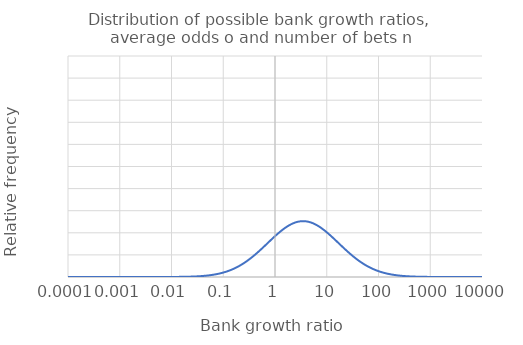
| Category | Probability mass function |
|---|---|
| 1.9287498479639178e-22 | 0 |
| 2.1315982402125517e-22 | 0 |
| 2.355780384104144e-22 | 0 |
| 2.6035399698849826e-22 | 0 |
| 2.877356658764434e-22 | 0 |
| 3.179970900197772e-22 | 0 |
| 3.5144113592254203e-22 | 0 |
| 3.884025228370648e-22 | 0 |
| 4.292511727467372e-22 | 0 |
| 4.743959126695607e-22 | 0 |
| 5.242885663363538e-22 | 0 |
| 5.7942847619451405e-22 | 0 |
| 6.403675009950656e-22 | 0 |
| 7.077155389805258e-22 | 0 |
| 7.821466319515107e-22 | 0 |
| 8.64405711303628e-22 | 0 |
| 9.55316053551265e-22 | 0 |
| 1.0557875199556575e-21 | 0 |
| 1.1668256627222069e-21 | 0 |
| 1.2895417889049291e-21 | 0 |
| 1.4251640827409756e-21 | 0 |
| 1.5750498977312845e-21 | 0 |
| 1.740699341490641e-21 | 0 |
| 1.92377028932889e-21 | 0 |
| 2.1260949768242666e-21 | 0 |
| 2.3496983374529006e-21 | 0 |
| 2.5968182688036488e-21 | 0 |
| 2.8699280302093464e-21 | 0 |
| 3.1717609959575027e-21 | 0 |
| 3.5053380118188886e-21 | 0 |
| 3.873997628687352e-21 | 0 |
| 4.281429515919289e-21 | 0 |
| 4.731711388784703e-21 | 0 |
| 5.2293498196121955e-21 | 0 |
| 5.7793253410795405e-21 | 0 |
| 6.38714229305874e-21 | 0 |
| 7.058883911899535e-21 | 0 |
| 7.801273213503439e-21 | 0 |
| 8.621740279526566e-21 | 0 |
| 9.52849662013418e-21 | 0 |
| 1.053061735755441e-20 | 0 |
| 1.1638132052951775e-20 | 0 |
| 1.2862125085646354e-20 | 0 |
| 1.4214846589307618e-20 | 0 |
| 1.5709835055409612e-20 | 0 |
| 1.7362052831004057e-20 | 0 |
| 1.918803586691868e-20 | 0 |
| 2.1206059215111002e-20 | 0 |
| 2.3436319931530804e-20 | 0 |
| 2.5901139215044538e-20 | 0 |
| 2.862518580549597e-20 | 0 |
| 3.163572287674602e-20 | 0 |
| 3.496288089568022e-20 | 0 |
| 3.8639959178048484e-20 | 0 |
| 4.270375915920945e-20 | 0 |
| 4.719495271526492e-20 | 0 |
| 5.215848922086619e-20 | 0 |
| 5.764404541766354e-20 | 0 |
| 6.370652259583364e-20 | 0 |
| 7.040659606464455e-20 | 0 |
| 7.78113224113446e-20 | 0 |
| 8.599481062602604e-20 | 0 |
| 9.50389638093068e-20 | 0 |
| 1.0503429888609e-19 | 0 |
| 1.1608085252937222e-19 | 0 |
| 1.2828918236089033e-19 | 0 |
| 1.4178147344895955e-19 | 0 |
| 1.5669276117770492e-19 | 0 |
| 1.731722827265726e-19 | 0 |
| 1.913849706861821e-19 | 0 |
| 2.1151310375912909e-19 | 0 |
| 2.3375813106650675e-19 | 0 |
| 2.583426883184192e-19 | 0 |
| 2.8551282602699863e-19 | 0 |
| 3.155404720626312e-19 | 0 |
| 3.487261531994818e-19 | 0 |
| 3.8540200288846083e-19 | 0 |
| 4.2593508536043427e-19 | 0 |
| 4.707310693284212e-19 | 0 |
| 5.202382880564233e-19 | 0 |
| 5.749522264294214e-19 | 0 |
| 6.354204799326421e-19 | 0 |
| 7.022482351712277e-19 | 0 |
| 7.761043267811902e-19 | 0 |
| 8.577279313512516e-19 | 0 |
| 9.4793596535059e-19 | 0 |
| 1.0476312611034384e-18 | 0 |
| 1.1578116026384373e-18 | 0 |
| 1.2795797118465605e-18 | 0 |
| 1.4141542848924377e-18 | 0 |
| 1.5628821893351887e-18 | 0 |
| 1.7272519440316511e-18 | 0 |
| 1.9089086167334096e-18 | 0 |
| 2.10967028847778e-18 | 0 |
| 2.3315462495539077e-18 | 0 |
| 2.576757109155329e-18 | 0 |
| 2.8477570199831504e-18 | 0 |
| 3.1472582402311535e-18 | 0 |
| 3.478258278777416e-18 | 0 |
| 3.844069895260664e-18 | 0 |
| 4.248354255292193e-18 | 0 |
| 4.6951575726318636e-18 | 0 |
| 5.188951605055393e-18 | 0 |
| 5.734678409209182e-18 | 0 |
| 6.337799802374316e-18 | 0 |
| 7.00435202616969e-18 | 0 |
| 7.74100615928699e-18 | 0 |
| 8.555134883888458e-18 | 0 |
| 9.454886273888019e-18 | 0 |
| 1.0449265343613678e-17 | 0 |
| 1.1548224173017592e-17 | 0 |
| 1.2762761511437256e-17 | 0 |
| 1.4105032856775672e-17 | 0 |
| 1.5588472111809966e-17 | 0 |
| 1.7227926035205676e-17 | 0 |
| 1.9039802832867636e-17 | 0 |
| 2.104223637677967e-17 | 0 |
| 2.325526769489041e-17 | 0 |
| 2.570104554845702e-17 | 0 |
| 2.840404810429232e-17 | 0 |
| 3.139132792048565e-17 | 0 |
| 3.469278269749689e-17 | 0 |
| 3.834145450439163e-17 | 0 |
| 4.237386047497423e-17 | 0 |
| 4.683035828353674e-17 | 0 |
| 5.1755550058027877e-17 | 0 |
| 5.71987287731409e-17 | 0 |
| 6.321437159097217e-17 | 0 |
| 6.986268508676995e-17 | 0 |
| 7.721020781657552e-17 | 0 |
| 8.533047625745642e-17 | 0 |
| 9.43047607852855e-17 | 0 |
| 1.0422287905597846e-16 | 0 |
| 1.1518409493078306e-16 | 0 |
| 1.2729811194236624e-16 | 0 |
| 1.4068617124464166e-16 | 0 |
| 1.5548226503498862e-16 | 0 |
| 1.718344775931998e-16 | 0 |
| 1.8990646735872619e-16 | 0 |
| 2.0987910487934672e-16 | 0 |
| 2.3195228302440306e-16 | 0 |
| 2.563469175798224e-16 | 0 |
| 2.833071582475551e-16 | 0 |
| 3.131028321778537e-16 | 0 |
| 3.4603214449008444e-16 | 0 |
| 3.8242466280979234e-16 | 0 |
| 4.226446156922688e-16 | 0 |
| 4.670945379443546e-16 | 0 |
| 5.162192993280835e-16 | 0 |
| 5.705105569667864e-16 | 0 |
| 6.305116760148333e-16 | 0 |
| 6.968231678387296e-16 | 0 |
| 7.70108700136711e-16 | 0 |
| 8.511017391481338e-16 | 0 |
| 9.406128904301246e-16 | 0 |
| 1.039538011670451e-15 | 0 |
| 1.1488671787323672e-15 | 0 |
| 1.2696945946666312e-15 | 0 |
| 1.40322954086341e-15 | 0 |
| 1.5508084799468865e-15 | 0 |
| 1.7139084315424027e-15 | 0 |
| 1.894161754785313e-15 | 0 |
| 2.093372485519867e-15 | 0 |
| 2.3135343916962954e-15 | 0 |
| 2.5568509276705832e-15 | 0 |
| 2.8257572871162737e-15 | 0 |
| 3.122944775261248e-15 | 0 |
| 3.4513877443750256e-15 | 0 |
| 3.814373362085991e-15 | 0 |
| 4.215534510459875e-15 | 0 |
| 4.658886145104523e-15 | 0 |
| 5.1488654781950874e-15 | 0 |
| 5.690376387584882e-15 | 0 |
| 6.28883849646318e-15 | 0 |
| 6.950241414765698e-15 | 0 |
| 7.681204685204004e-15 | 0 |
| 8.489044033873888e-15 | 0 |
| 9.381844588501017e-15 | 0 |
| 1.036854179711673e-14 | 0 |
| 1.145901085702524e-14 | 0 |
| 1.2664165549097415e-14 | 0 |
| 1.3996067466557998e-14 | 0 |
| 1.546804673146463e-14 | 0 |
| 1.7094835407049807e-14 | 0 |
| 1.889271494116135e-14 | 0 |
| 2.0879679116464823e-14 | 0 |
| 2.307561413826839e-14 | 0 |
| 2.550249766234951e-14 | 0 |
| 2.8184618754720903e-14 | 0 |
| 3.114882098476706e-14 | 0 |
| 3.442477108470906e-14 | 0 |
| 3.804525586423197e-14 | 0 |
| 4.2046510351896226e-14 | 0 |
| 4.646858044748244e-14 | 0 |
| 5.135572371481633e-14 | 0 |
| 5.6756852326342954e-14 | 0 |
| 6.272602259258849e-14 | 0 |
| 6.932297597588493e-14 | 0 |
| 7.661373700300492e-14 | 0 |
| 8.467127406081728e-14 | 0 |
| 9.357622968842834e-14 | 0 |
| 1.0341772767481818e-13 | 0 |
| 1.1429426503967626e-13 | 0 |
| 1.263146978246806e-13 | 0 |
| 1.3959933056135048e-13 | 0 |
| 1.5428112031923373e-13 | 0 |
| 1.7050700738494725e-13 | 0 |
| 1.8843938588995363e-13 | 0 |
| 2.082577291056116e-13 | 0 |
| 2.301603856719986e-13 | 0 |
| 2.543665647377682e-13 | 0 |
| 2.8111852987898835e-13 | 0 |
| 3.1068402375443836e-13 | 0 |
| 3.4335894776412945e-13 | 0 |
| 3.794703235299718e-13 | 0 |
| 4.193795658380826e-13 | 0 |
| 4.634860997994409e-13 | 0 |
| 5.1223135843065e-13 | 0 |
| 5.661032006639385e-13 | 0 |
| 6.256407940033283e-13 | 0 |
| 6.914400106942365e-13 | 0 |
| 7.64159391413186e-13 | 0 |
| 8.445267361642401e-13 | 0 |
| 9.333463883460648e-13 | 0 |
| 1.031507284891012e-12 | 0 |
| 1.1399918530447199e-12 | 0 |
| 1.2598858428281937e-12 | 0 |
| 1.3923891935889478e-12 | 0 |
| 1.5388280433973104e-12 | 0 |
| 1.7006680014819602e-12 | 0 |
| 1.8795288165396976e-12 | 0 |
| 2.0772005877248162e-12 | 0 |
| 2.295661680563113e-12 | 0 |
| 2.5370985270990234e-12 | 0 |
| 2.8039275084424048e-12 | 0 |
| 3.0988191387228603e-12 | 0 |
| 3.424724792492736e-12 | 0 |
| 3.7849062430756345e-12 | 0 |
| 4.182968307490155e-12 | 0 |
| 4.622894924670239e-12 | 0 |
| 5.1090890280650675e-12 | 0 |
| 5.6464166116768965e-12 | 0 |
| 6.240255430564552e-12 | 0 |
| 6.896548823223582e-12 | 0 |
| 7.621865194515543e-12 | 0 |
| 8.42346375447158e-12 | 0 |
| 9.309367170906311e-12 | 0 |
| 1.0288441862973836e-11 | 0 |
| 1.1370486739270737e-11 | 0 |
| 1.2566331268606837e-11 | 0 |
| 1.3887943864968955e-11 | 0 |
| 1.5348551671430818e-11 | 0 |
| 1.6962772941846738e-11 | 0 |
| 1.874676334524954e-11 | 0 |
| 2.0718377657216365e-11 | 0 |
| 2.2897348456463827e-11 | 0 |
| 2.5305483615128175e-11 | 0 |
| 2.7966884559279504e-11 | 0 |
| 3.0908187484094626e-11 | 0 |
| 3.415882993785115e-11 | 0 |
| 3.775134544280492e-11 | 0 |
| 4.17216891016157e-11 | 0 |
| 4.6109597448099425e-11 | 0 |
| 5.0958986143814656e-11 | 0 |
| 5.6318389500763924e-11 | 0 |
| 6.224144622910127e-11 | 0 |
| 6.8787436271372e-11 | 0 |
| 7.602187409610241e-11 | 0 |
| 8.401716438862092e-11 | 0 |
| 9.285332670148491e-11 | 0 |
| 1.0261879631705828e-10 | 0 |
| 1.1341130933754135e-10 | 0 |
| 1.2533888086073202e-10 | 0 |
| 1.3852088603142962e-10 | 0 |
| 1.5308925478800744e-10 | 0 |
| 1.6918979226157917e-10 | 0 |
| 1.869836380427578e-10 | 0 |
| 2.0664887892083952e-10 | 0 |
| 2.283823312362479e-10 | 0 |
| 2.524015106846211e-10 | 0 |
| 2.7894680928700346e-10 | 0 |
| 3.0828390131399067e-10 | 0 |
| 3.407064022431259e-10 | 0 |
| 3.7653880736128686e-10 | 0 |
| 4.161397394225834e-10 | 0 |
| 4.5990553786541793e-10 | 0 |
| 5.082742255107992e-10 | 0 |
| 5.617298924419595e-10 | 0 |
| 6.208075409406161e-10 | 0 |
| 6.860984399696268e-10 | 0 |
| 7.582560427915031e-10 | 0 |
| 8.380025269482943e-10 | 0 |
| 9.261360220571604e-10 | 0 |
| 1.0235385977598416e-09 | 0 |
| 1.1311850917721068e-09 | 0 |
| 1.2501528663872668e-09 | 0 |
| 1.38163259108012e-09 | 0 |
| 1.5269401591272541e-09 | 0 |
| 1.6875298575092453e-09 | 0 |
| 1.8650089219035623e-09 | 0 |
| 2.0611536224394367e-09 | 0 |
| 2.2779270412063423e-09 | 0 |
| 2.5174987194393603e-09 | 0 |
| 2.782266371017069e-09 | 0 |
| 3.074879879587939e-09 | 0 |
| 3.3982678194965443e-09 | 0 |
| 3.75566676593993e-09 | 0 |
| 4.150653687700037e-09 | 0 |
| 4.587181746649529e-09 | 0 |
| 5.06961986232452e-09 | 0 |
| 5.602796437539736e-09 | 0 |
| 6.1920476826667665e-09 | 0 |
| 6.843271022221027e-09 | 0 |
| 7.562984118268498e-09 | 0 |
| 8.35839010137835e-09 | 0 |
| 9.23744966197473e-09 | 0 |
| 1.0208960723602207e-08 | 0 |
| 1.1282646495501697e-08 | 0 |
| 1.2469252785756615e-08 | 0 |
| 1.3780655548951985e-08 | 0 |
| 1.5229979744719554e-08 | 0 |
| 1.6831730696745253e-08 | 0 |
| 1.8601939266924034e-08 | 0 |
| 2.0558322297613905e-08 | 0 |
| 2.2720459927749048e-08 | 0 |
| 2.5109991557451416e-08 | 0 |
| 2.775083242242038e-08 | 0 |
| 3.0669412945649824e-08 | 0 |
| 3.389494326198502e-08 | 0 |
| 3.745970556297002e-08 | 0 |
| 4.1399377187871084e-08 | 0 |
| 4.575338769447957e-08 | 0 |
| 5.05653134833791e-08 | 0 |
| 5.588331392520908e-08 | 0 |
| 6.176061335583303e-08 | 0 |
| 6.825603376338119e-08 | 0 |
| 7.54345834984785e-08 | 0 |
| 8.336810789966771e-08 | 0 |
| 9.213600834570554e-08 | 0 |
| 1.0182603693124907e-07 | 0 |
| 1.1253517471931329e-07 | 0 |
| 1.2437060236034683e-07 | 0 |
| 1.3745077279220577e-07 | 0 |
| 1.5190659675696923e-07 | 0 |
| 1.6788275299964684e-07 | 0 |
| 1.855391362616868e-07 | 0 |
| 2.0505245756129103e-07 | 0 |
| 2.266180127766797e-07 | 0 |
| 2.5045163723288184e-07 | 0 |
| 2.76791865854213e-07 | 0 |
| 3.0590232050197195e-07 | 0 |
| 3.3807434839063524e-07 | 0 |
| 3.736299379887046e-07 | 0 |
| 4.1292494158752376e-07 | 0 |
| 4.5635263679061665e-07 | 0 |
| 5.043476625681282e-07 | 0 |
| 5.57390369269725e-07 | 0 |
| 6.16011626132346e-07 | 0 |
| 6.807981343979572e-07 | 0 |
| 7.523982992167781e-07 | 0 |
| 8.315287191039623e-07 | 0 |
| 9.189813578983929e-07 | 0 |
| 1.0156314710029718e-06 | 0 |
| 1.1224463652348746e-06 | 0 |
| 1.2404950799572996e-06 | 0 |
| 1.3709590863847322e-06 | 0 |
| 1.515144112143965e-06 | 0 |
| 1.6744932094350571e-06 | 0 |
| 1.8506011975827791e-06 | 0 |
| 2.0452306245244524e-06 | 0 |
| 2.2603294069821185e-06 | 0 |
| 2.498050325867811e-06 | 0 |
| 2.7607725720384984e-06 | 0 |
| 3.051125558037853e-06 | 0 |
| 3.372015234140766e-06 | 0 |
| 3.726653172080419e-06 | 0 |
| 4.118588707537639e-06 | 0 |
| 4.551744463085366e-06 | 0 |
| 5.030455607113798e-06 | 0 |
| 5.559513241652744e-06 | 0 |
| 6.14421235333108e-06 | 0 |
| 6.790404807382643e-06 | 0 |
| 7.504557915080364e-06 | 0 |
| 8.293819160761231e-06 | 0 |
| 9.166087736251884e-06 | 0 |
| 1.0130093598635425e-05 | 0 |
| 1.119548484259615e-05 | 0 |
| 1.237292426179398e-05 | 0 |
| 1.3674196065687303e-05 | 0 |
| 1.511232381986204e-05 | 0 |
| 1.67017007902534e-05 | 0 |
| 1.8458233995789117e-05 | 0 |
| 2.039950341118138e-05 | 0 |
| 2.2544937913222622e-05 | 0 |
| 2.4916009731514714e-05 | 0 |
| 2.7536449349759877e-05 | 0 |
| 3.0432483008417682e-05 | 0 |
| 3.3633095185734506e-05 | 0 |
| 3.717031868414383e-05 | 0 |
| 4.107955522531962e-05 | 0 |
| 4.539992976250574e-05 | 0 |
| 5.017468205619837e-05 | 0 |
| 5.545159943220245e-05 | 0 |
| 6.128349505325023e-05 | 0 |
| 6.772873649088493e-05 | 0 |
| 7.48518298877349e-05 | 0 |
| 8.272406555667015e-05 | 0 |
| 9.142423147821517e-05 | 0 |
| 0.00010103940183713955 | 0 |
| 0.00011166580849016575 | 0 |
| 0.00012340980408673589 | 0 |
| 0.00013638892648207366 | 0 |
| 0.0001507330750955453 | 0 |
| 0.00016658581098770927 | 0 |
| 0.00018410579366766292 | 0 |
| 0.0002034683690107367 | 0 |
| 0.00022486732417895046 | 0 |
| 0.0002485168271080649 | 0 |
| 0.00027465356997226695 | 0 |
| 0.00030353913807900425 | 0 |
| 0.0003354626279026638 | 0 |
| 0.00037074354045925616 | 0 |
| 0.000409734978979972 | 0 |
| 0.0004528271828870017 | 0 |
| 0.0005004514334408367 | 0 |
| 0.0005530843701480831 | 0 |
| 0.0006112527611298481 | 0 |
| 0.0006755387751941485 | 0 |
| 0.0007465858083770154 | 0 |
| 0.0008251049232662754 | 0 |
| 0.0009118819655549261 | 0 |
| 0.0010077854290489632 | 0 |
| 0.0011137751478453028 | 0 |
| 0.001230911902674033 | 0 |
| 0.0013603680375485028 | 0 |
| 0.0015034391929782454 | 0 |
| 0.0016615572731746777 | 0 |
| 0.0018363047770297274 | 0 |
| 0.002029430636296641 | 0 |
| 0.0022428677194868034 | 0 |
| 0.0024787521766674635 | 0 |
| 0.0027394448187695896 | 0 |
| 0.0030275547453771623 | 0 |
| 0.003345965457472761 | 0 |
| 0.0036978637164845744 | 0 |
| 0.004086771438465882 | 0 |
| 0.004516580942614672 | 0 |
| 0.00499159390691243 | 0 |
| 0.005516564420763217 | 0 |
| 0.0060967465655183345 | 0 |
| 0.006737946999088447 | 0 |
| 0.0074465830709276315 | 0 |
| 0.008229747049023663 | 0 |
| 0.00909527710169983 | 0 |
| 0.010051835744638013 | 0 |
| 0.0111089965382472 | 0 |
| 0.012277339903073845 | 0 |
| 0.0135685590122069 | 0.001 |
| 0.014995576820484297 | 0.001 |
| 0.016572675401768523 | 0.001 |
| 0.018315638888742224 | 0.001 |
| 0.02024191144581328 | 0.001 |
| 0.022370771856175427 | 0.002 |
| 0.024723526470350258 | 0.002 |
| 0.02732372244730457 | 0.002 |
| 0.03019738342233178 | 0.003 |
| 0.033373269960340755 | 0.003 |
| 0.03688316740125623 | 0.004 |
| 0.04076220397838415 | 0.005 |
| 0.045049202393577625 | 0.006 |
| 0.04978706836788585 | 0.007 |
| 0.05502322005643145 | 0.008 |
| 0.060810062625244736 | 0.009 |
| 0.06720551273977936 | 0.011 |
| 0.0742735782143666 | 0.013 |
| 0.08208499862393495 | 0.015 |
| 0.09071795328945248 | 0.017 |
| 0.10025884372284792 | 0.02 |
| 0.11080315836238272 | 0.023 |
| 0.1224564282530359 | 0.027 |
| 0.13533528323667238 | 0.03 |
| 0.149568619222701 | 0.035 |
| 0.16529888822165947 | 0.039 |
| 0.18268352405281527 | 0.044 |
| 0.2018965179947445 | 0.05 |
| 0.22313016014852832 | 0.055 |
| 0.24659696394171535 | 0.062 |
| 0.27253179303413294 | 0.069 |
| 0.30119421191233514 | 0.076 |
| 0.3328710836982266 | 0.083 |
| 0.3678794411716048 | 0.091 |
| 0.4065696597407787 | 0.1 |
| 0.44932896411742007 | 0.109 |
| 0.49658530379162885 | 0.118 |
| 0.5488116360942689 | 0.127 |
| 0.6065306597129013 | 0.137 |
| 0.6703200460359353 | 0.146 |
| 0.7408182206820451 | 0.156 |
| 0.8187307530783434 | 0.166 |
| 0.9048374180363592 | 0.175 |
| 1.0000000000004416 | 0.185 |
| 1.1051709180761358 | 0.194 |
| 1.2214027581607092 | 0.203 |
| 1.3498588075765992 | 0.211 |
| 1.4918246976419292 | 0.219 |
| 1.6487212707008563 | 0.226 |
| 1.8221188003913136 | 0.232 |
| 2.0137527074713657 | 0.238 |
| 2.22554092849345 | 0.243 |
| 2.4596031111580356 | 0.247 |
| 2.718281828460246 | 0.25 |
| 3.0041660239477603 | 0.252 |
| 3.3201169227380145 | 0.253 |
| 3.669296667620866 | 0.253 |
| 4.055199966846467 | 0.252 |
| 4.481689070340046 | 0.25 |
| 4.953032424397305 | 0.247 |
| 5.473947391729621 | 0.243 |
| 6.049647464415623 | 0.238 |
| 6.685894442282228 | 0.232 |
| 7.389056098933919 | 0.226 |
| 8.166169912571263 | 0.219 |
| 9.025013499438115 | 0.211 |
| 9.974182454819134 | 0.203 |
| 11.02317638064648 | 0.194 |
| 12.182493960708868 | 0.185 |
| 13.463738035007653 | 0.175 |
| 14.879731724879425 | 0.166 |
| 16.444646771104335 | 0.156 |
| 18.174145369451114 | 0.146 |
| 20.08553692319657 | 0.137 |
| 22.197951281451473 | 0.127 |
| 24.532530197120227 | 0.118 |
| 27.112638920669912 | 0.109 |
| 29.964100047410305 | 0.1 |
| 33.115451958707006 | 0.092 |
| 36.598234443694224 | 0.084 |
| 40.44730436008534 | 0.076 |
| 44.70118449332067 | 0.069 |
| 49.40244910555211 | 0.062 |
| 54.59815003316849 | 0.055 |
| 60.340287597388745 | 0.05 |
| 66.68633104095471 | 0.044 |
| 73.69979369962844 | 0.039 |
| 81.45086866500418 | 0.035 |
| 90.01713130056163 | 0.03 |
| 99.48431564197777 | 0.027 |
| 109.94717245217205 | 0.023 |
| 121.5104175187885 | 0.02 |
| 134.2897796849947 | 0.017 |
| 148.413159102642 | 0.015 |
| 164.02190729997395 | 0.013 |
| 181.27224187523092 | 0.011 |
| 200.3368099748797 | 0.009 |
| 221.4064162042843 | 0.008 |
| 244.69193226432776 | 0.007 |
| 270.42640742627117 | 0.006 |
| 298.86740096719114 | 0.005 |
| 330.29955990979323 | 0.004 |
| 365.0374678654884 | 0.003 |
| 403.42879349291144 | 0.003 |
| 445.8577700827116 | 0.002 |
| 492.74904109347125 | 0.002 |
| 544.5719101261665 | 0.002 |
| 601.8450378723442 | 0.001 |
| 665.1416330446514 | 0.001 |
| 735.0951892422926 | 0.001 |
| 812.4058251678961 | 0.001 |
| 897.8472916508075 | 0.001 |
| 992.2747156054563 | 0 |
| 1096.633158428934 | 0 |
| 1211.9670744931016 | 0 |
| 1339.4307643949974 | 0 |
| 1480.2999275851853 | 0 |
| 1635.9844299966333 | 0 |
| 1808.0424144568437 | 0 |
| 1998.1958951049799 | 0 |
| 2208.3479918881603 | 0 |
| 2440.60197762555 | 0 |
| 2697.2823282696695 | 0 |
| 2980.95798704301 | 0 |
| 3294.4680752852564 | 0 |
| 3640.9503073339174 | 0 |
| 4023.8723938240355 | 0 |
| 4447.066747701761 | 0 |
| 4914.768840301238 | 0 |
| 5431.659591365304 | 0 |
| 6002.912217263588 | 0 |
| 6634.244006280718 | 0 |
| 7331.973539159121 | 0 |
| 8103.0839275788385 | 0 |
| 8955.292703486326 | 0 |
| 9897.129058748129 | 0 |
| 10938.019208169835 | 0 |
| 12088.380730222121 | 0 |
| 13359.726829667545 | 0 |
| 14764.781565583537 | 0 |
| 16317.607198022348 | 0 |
| 18033.74492783615 | 0 |
| 19930.370438238722 | 0 |
| 22026.465794816027 | 0 |
| 24343.009424418673 | 0 |
| 26903.186074308916 | 0 |
| 29732.618852903954 | 0 |
| 32859.62567445716 | 0 |
| 36315.50267426192 | 0 |
| 40134.83743089267 | 0 |
| 44355.85513031651 | 0 |
| 49020.801136402304 | 0 |
| 54176.36379672147 | 0 |
| 59874.14171522292 | 0 |
| 66171.16016840433 | 0 |
| 73130.44183344611 | 0 |
| 80821.63754034735 | 0 |
| 89321.72336084288 | 0 |
| 98715.7710108017 | 0 |
| 109097.79927655308 | 0 |
| 120571.71498650085 | 0 |
| 133252.35294558643 | 0 |
| 147266.6252406139 | 0 |
| 162754.79141907158 | 0 |
| 179871.8622538258 | 0 |
| 198789.15114303702 | 0 |
| 219695.98867222882 | 0 |
| 242801.6174984241 | 0 |
| 268337.28652098554 | 0 |
| 296558.56529832556 | 0 |
| 327747.90187394724 | 0 |
| 362217.4496113974 | 0 |
| 400312.19133004756 | 0 |
| 442413.39200910286 | 0 |
| 488942.4146156614 | 0 |
| 540364.9372469143 | 0 |
| 597195.6137930617 | 0 |
| 660003.2247664277 | 0 |
| 729416.3698480006 | 0 |
| 806129.7591243207 | 0 |
| 890911.1659795259 | 0 |
| 984609.111229438 | 0 |
| 1088161.355403085 | 0 |
| 1202604.284165268 | 0 |
| 1329083.280812636 | 0 |
| 1468864.1896546942 | 0 |
| 1623345.9850091198 | 0 |
| 1794074.772606945 | 0 |
| 1982759.2635383753 | 0 |
| 2191287.8756077006 | 0 |
| 2421747.633253397 | 0 |
| 2676445.0551901828 | 0 |
| 2957929.2388235605 | 0 |
| 3269017.3724734345 | 0 |
| 3612822.930741706 | 0 |
| 3992786.8352125613 | 0 |
| 4412711.892352224 | 0 |
| 4876800.853274235 | 0 |
| 5389698.476285186 | 0 |
| 5956538.013187015 | 0 |
| 6582992.584586386 | 0 |
| 7275331.958392514 | 0 |
| 8040485.299761751 | 0 |
| 8886110.520511441 | 0 |
| 9820670.922075313 | 0 |
| 10853519.899068806 | 0 |
| 11994994.5512062 | 0 |
| 13256519.140468966 | 0 |
| 14650719.428959502 | 0 |
| 16191549.041771924 | 0 |
| 17894429.119561974 | 0 |
| 19776402.65850594 | 0 |
| 21856305.08233472 | 0 |
| 24154952.75358534 | 0 |
| 26695351.31075384 | 0 |
| 29502925.916457806 | 0 |
| 32605775.721009538 | 0 |
| 36034955.08815682 | 0 |
| 39824784.39759306 | 0 |
| 44013193.53485271 | 0 |
| 48642101.5063544 | 0 |
| 53757835.97890661 | 0 |
| 59411596.942568384 | 0 |
| 65659969.13735874 | 0 |
| 72565488.37235355 | 0 |
| 80197267.40508182 | 0 |
| 88631687.6452326 | 0 |
| 97953163.6054759 | 0 |
| 108254987.75027806 | 0 |
| 119640264.19824296 | 0 |
| 132222940.6227854 | 0 |
| 146128948.6787458 | 0 |
| 161497464.36871892 | 0 |
| 178482300.96326652 | 0 |
| 197253448.4158276 | 0 |
| 217998774.67930788 | 0 |
| 240925905.9516973 | 0 |
| 266264304.66884482 | 0 |
| 294267566.0416416 | 0 |
| 325215956.1221278 | 0 |
| 359419216.80034196 | 0 |
| 397219665.8052647 | 0 |
| 438995622.735707 | 0 |
| 485165195.4100126 | 0 |
| 536190464.4296354 | 0 |
| 592582107.8371089 | 0 |
| 654904512.153541 | 0 |
| 723781420.948614 | 0 |
| 799902177.4758776 | 0 |
| 884028623.8517267 | 0 |
| 977002725.8273655 | 0 |
| 1079754999.4650412 | 0 |
| 1193313824.0555518 | 0 |
| 1318815734.4838378 | 0 |
| 1457516796.0521147 | 0 |
| 1610805175.6035943 | 0 |
| 1780215034.7628317 | 0 |
| 1967441884.3409123 | 0 |
| 2174359553.5775313 | 0 |
| 2403038944.053839 | 0 |
| 2655768755.97152 | 0 |
| 2935078394.2336693 | 0 |
| 3243763283.579227 | 0 |
| 3584912846.1333365 | 0 |
| 3961941421.382368 | 0 |
| 4378622438.031094 | 0 |
| 4839126179.745461 | 0 |
| 5348061522.753201 | 0 |
| 5910522063.02621 | 0 |
| 6532137094.701056 | 0 |
| 7219127949.94677 | 0 |
| 7978370264.148251 | 0 |
| 8817462789.576181 | 0 |
| 9744803446.253784 | 0 |
| 10769673371.163044 | 0 |
| 11902329806.983133 | 0 |
| 13154108760.022715 | 0 |
| 14537538454.781242 | 0 |
| 16066464720.630642 | 0 |
| 17756189565.529396 | 0 |
| 19623624323.661385 | 0 |
| 21687458909.75249 | 0 |
| 23968348874.019077 | 0 |
| 26489122129.857117 | 0 |
| 29275007423.272186 | 0 |
| 32353886830.64917 | 0 |
| 35756574811.9442 | 0 |
| 39517126612.157005 | 0 |
| 43673179097.66922 | 0 |
| 48266327438.65335 | 0 |
| 53342541407.51642 | 0 |
| 58952625459.83325 | 0 |
| 65152727202.4138 | 0 |
| 72004899337.424 | 0 |
| 79577720706.68558 | 0 |
| 87946982651.7753 | 0 |
| 97196447559.2457 | 0 |
| 107418687182.74326 | 0 |
| 118716009132.23334 | 0 |
| 131201480802.94746 | 0 |
| 145000060991.8781 | 0 |
| 160249850527.41907 | 0 |
| 177103474428.8733 | 0 |
| 195729609428.94516 | 0 |
| 216314672147.17557 | 0 |
| 239064684810.12708 | 0 |
| 264207337191.07385 | 0 |
| 291994265405.7817 | 0 |
| 322703570371.3325 | 0 |
| 356642601133.57544 | 0 |
| 394151030919.68115 | 0 |
| 435604256701.9676 | 0 |
| 481417156296.9743 | 0 |
| 532048240602.0954 | 0 |
| 588004242526.7516 | 0 |
| 649845188545.6667 | 0 |
| 718190003632.058 | 0 |
| 793722705666.7953 | 0 |
| 877199251319.2605 | 0 |
| 969455101915.7792 | 0 |
| 1071413585017.3838 | 0 |
| 1184095135392.3845 | 0 |
| 1308627507870.5117 | 0 |
| 1446257064292.3025 | 0 |
| 1598361247517.3171 | 0 |
| 1766462367335.2532 | 0 |
| 1952242836253.9866 | 0 |
| 2157562007649.4275 | 0 |
| 2384474784799.0586 | 0 |
| 2635252187044.612 | 0 |
| 2912404078916.956 | 0 |
| 3218704289703.918 | 0 |
| 3557218374866.109 | 0 |
| 3931334297146.3467 | 0 |
| 4344796334439.515 | 0 |
| 4801742553784.234 | 0 |
| 5306746226528.635 | 0 |
| 5864861599167.138 | 0 |
| 6481674477938.166 | 0 |
| 7163358133450.427 | 0 |
| 7916735084850.077 | 0 |
| 8749345381885.462 | 0 |
| 9669522068259.297 | 0 |
| 10686474581530.879 | 0 |
| 11810380924262.57 | 0 |
| 13052489528890.398 | 0 |
| 14425231835816.6 | 0 |
| 15942346711443.514 | 0 |
| 17619017951366.336 | 0 |
| 19472026244902.875 | 0 |
| 21519917121872.45 | 0 |
| 23783186562491.656 | 0 |
| 26284486128033.348 | 0 |
| 29048849665265.277 | 0 |
| 32103943853602.742 | 0 |
| 35480345102535.24 | 0 |
| 39211845570609.734 | 0 |
| 43335791368711.336 | 0 |
| 47893456332493.5 | 0 |
| 52930455104797.86 | 0 |
| 58497199662331.38 | 0 |
| 64649403855673.33 | 0 |
| 71448641012217.9 | 0 |
| 78962960182730.06 | 0 |
| 87267567199118.72 | 0 |
| 96445577359678.45 | 0 |
| 106588847274931.88 | 0 |
| 117798894199461.62 | 0 |
| 130187912050715.27 | 0 |
| 143879894283440.88 | 0 |
| 159011874857857.7 | 0 |
| 175735299721588.8 | 0 |
| 194217542531607.7 | 0 |
| 214643579786053.3 | 0 |
| 237217842131196.4 | 0 |
| 262166260372058.75 | 0 |
| 289738526663847.9 | 0 |
| 320210593514970.7 | 0 |
| 353887435612488.7 | 0 |
| 391106102111291.3 | 0 |
| 432239089935324.44 | 0 |
| 477698071852005.6 | 0 |
| 527938016631648.44 | 0 |
| 583461742527836.2 | 0 |
| 644824949651506.9 | 0 |
| 712641781604440.1 | 0 |
| 787590972034845.4 | 0 |
| 870422637631843.0 | 0 |
| 961965785545412.1 | 0 |
| 1063136610368586.1 | 0 |
| 1174947663720884.0 | 0 |
| 1298517988205248.5 | 0 |
| 1435084317162539.5 | 0 |
| 1586013452314490.0 | 0 |
| 1752815943174734.8 | 0 |
| 1937161205136056.8 | 0 |
| 2140894227540746.8 | 0 |
| 2366054038954065.0 | 0 |
| 2614894114447461.5 | 0 |
| 2889904929134513.0 | 0 |
| 3193838883682933.5 | 0 |
| 3529737851265574.5 | 0 |
| 3900963621649544.0 | 0 |
| 4311231547118136.0 | 0 |
| 4764647726965252.0 | 0 |
| 5265750102717242.0 | 0 |
| 5819553875376959.0 | 0 |
| 6431601699241056.0 | 0 |
| 7108019154647143.0 | 0 |
| 7855576054840683.0 | 0 |
| 8681754200541364.0 | 0 |
| 9594822260319424.0 | 0 |
| 1.0603918526209892e+16 | 0 |
| 1.1719142372810772e+16 | 0 |
| 1.2951655335218522e+16 | 0 |
| 1.4313792817422834e+16 | 0 |
| 1.5819187549175828e+16 | 0 |
| 1.7482906026933528e+16 | 0 |
| 1.9321599304416428e+16 | 0 |
| 2.135366964195173e+16 | 0 |
| 2.359945468247991e+16 | 0 |
| 2.6081430997521e+16 | 0 |
| 2.882443904025698e+16 | 0 |
| 3.185593175713639e+16 | 0 |
| 3.5206249346189656e+16 | 0 |
| 3.890892291192865e+16 | 0 |
| 4.300101005591084e+16 | 0 |
| 4.752346576167121e+16 | 0 |
| 5.252155228596285e+16 | 0 |
| 5.804529215863578e+16 | 0 |
| 6.414996882492878e+16 | 0 |
| 7.089667994077082e+16 | 0 |
| 7.835294885865715e+16 | 0 |
| 8.659340042405651e+16 | 0 |
| 9.570050784594683e+16 | 0 |
| 1.0576541811641094e+17 | 0 |
| 1.1688886424036877e+17 | 0 |
| 1.2918217340534829e+17 | 0 |
| 1.4276838118139648e+17 | 0 |
| 1.5778346290241818e+17 | 0 |
| 1.7437769455302064e+17 | 0 |
| 1.9271715678107696e+17 | 0 |
| 2.129853970886716e+17 | 0 |
| 2.3538526683719392e+17 | 0 |
| 2.6014095145194326e+17 | 0 |
| 2.8750021414521702e+17 | 0 |
| 3.1773687561381523e+17 | 0 |
| 3.511535545286086e+17 | 0 |
| 3.880846962439099e+17 | 0 |
| 4.288999200389913e+17 | 0 |
| 4.740077183920646e+17 | 0 |
| 5.2385954531030176e+17 | 0 |
| 5.789543346332783e+17 | 0 |
| 6.398434935305368e+17 | 0 |
| 7.071364211698742e+17 | 0 |
| 7.815066077890387e+17 | 0 |
| 8.636983752123982e+17 | 0 |
| 9.545343262739327e+17 | 0 |
| 1.0549235777028835e+18 | 0 |
| 1.1658708588695442e+18 | 0 |
| 1.2884865674544998e+18 | 0 |
| 1.4239978826818314e+18 | 0 |
| 1.5737610473412603e+18 | 0 |
| 1.7392749415218358e+18 | 0 |
| 1.9221960839076582e+18 | 0 |
| 2.1243552107736443e+18 | 0 |
| 2.3477755986094976e+18 | 0 |
| 2.5946933137508654e+18 | 0 |
| 2.8675795916827924e+18 | 0 |
| 3.169165569995067e+18 | 0 |
| 3.502469622525186e+18 | 0 |
| 3.870827568258233e+18 | 0 |
| 4.2779260573244836e+18 | 0 |
| 4.727839468233042e+18 | 0 |
| 5.2250706856214e+18 | 0 |
| 5.774596166638365e+18 | 0 |
| 6.381915746999846e+18 | 0 |
| 7.053107685193262e+18 | 0 |
| 7.794889495731454e+18 | 0 |
| 8.614685180295765e+18 | 0 |
| 9.520699529640161e+18 | 0 |
| 1.0522000239894819e+19 | 0 |
| 1.1628608665116756e+19 | 0 |
| 1.2851600114369536e+19 | 0 |
| 1.4203214697138899e+19 | 0 |
| 1.569697982646255e+19 | 0 |
| 1.734784560582656e+19 | 0 |
| 1.9172334454825955e+19 | 0 |
| 2.1188706471093404e+19 | 0 |
| 2.3417142183493747e+19 | 0 |
| 2.5879944525639795e+19 | 0 |
| 2.8601762051148206e+19 | 0 |
| 3.1609835624648724e+19 | 0 |
| 3.4934271057513394e+19 | 0 |
| 3.860834041693566e+19 | 0 |
| 4.266881502396197e+19 | 0 |
| 4.715633347323211e+19 | 0 |
| 5.211580835769339e+19 | 0 |
| 5.75968757689266e+19 | 0 |
| 6.365439207183372e+19 | 0 |
| 7.03489829255758e+19 | 0 |
| 7.774765004554677e+19 | 0 |
| 8.592444177906123e+19 | 0 |
| 9.496119420610277e+19 | 0 |
| 1.049483501823186e+20 | 0 |
| 1.1598586452151778e+20 | 0 |
| 1.2818420437704366e+20 | 0 |
| 1.41665454834174e+20 | 0 |
| 1.565645407786885e+20 | 0 |
| 1.730305772704756e+20 | 0 |
| 1.9122836193717105e+20 | 0 |
| 2.1134002432420587e+20 | 0 |
| 2.3356684870851265e+20 | 0 |
| 2.5813128861922315e+20 | 0 |
| 2.8527919322735726e+20 | 0 |
| 3.1528226788695894e+20 | 0 |
| 3.484407934536032e+20 | 0 |
| 3.8508663159612624e+20 | 0 |
| 4.2558654617975017e+20 | 0 |
| 4.703458739621192e+20 | 0 |
| 5.1981258133980886e+20 | 0 |
| 5.744817477465896e+20 | 0 |
| 6.34900520574802e+20 | 0 |
| 7.016735912103615e+20 | 0 |
| 7.754692469873929e+20 | 0 |
| 8.570260596324894e+20 | 0 |
| 9.471602771387943e+20 | 0 |
| 1.0467739930502677e+21 | 0 |
| 1.1568641749170776e+21 | 0 |
| 1.278532642281935e+21 | 0 |
| 1.4129970940604118e+21 | 0 |
| 1.5616032956809698e+21 | 0 |
| 1.7258385479576967e+21 | 0 |
| 1.9073465724967531e+21 | 0 |
| 2.1079439626146795e+21 | 0 |
| 2.329638364414887e+21 | 0 |
| 2.5746485699846545e+21 | 0 |
| 2.845426723812098e+21 | 0 |
| 3.144682864672403e+21 | 0 |
| 3.4754120486067624e+21 | 0 |
| 3.8409243244499084e+21 | 0 |
| 4.244877861911398e+21 | 0 |
| 4.6913155637676186e+21 | 0 |
| 5.184705528591641e+21 | 0 |